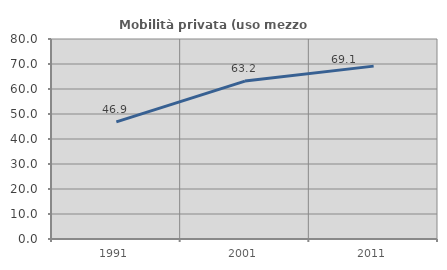
| Category | Mobilità privata (uso mezzo privato) |
|---|---|
| 1991.0 | 46.868 |
| 2001.0 | 63.17 |
| 2011.0 | 69.149 |